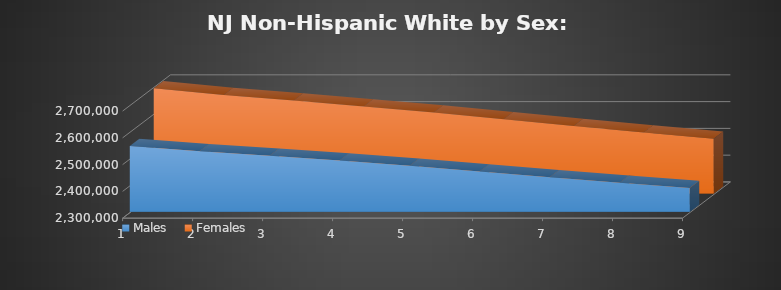
| Category | Males | Females |
|---|---|---|
| 0 | 2544964 | 2693410 |
| 1 | 2526114 | 2668026 |
| 2 | 2509009 | 2647318 |
| 3 | 2491404 | 2625302 |
| 4 | 2471779 | 2602555 |
| 5 | 2450011 | 2577516 |
| 6 | 2428586 | 2552191 |
| 7 | 2407788 | 2528205 |
| 8 | 2388021 | 2504874 |